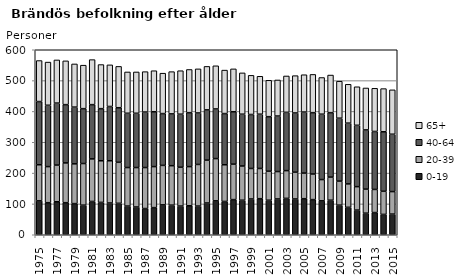
| Category | 0-19 | 20-39 | 40-64 | 65+ |
|---|---|---|---|---|
| 1975.0 | 110 | 117 | 205 | 133 |
| 1976.0 | 104 | 117 | 199 | 140 |
| 1977.0 | 107 | 119 | 201 | 140 |
| 1978.0 | 104 | 129 | 189 | 142 |
| 1979.0 | 101 | 129 | 184 | 140 |
| 1980.0 | 96 | 135 | 178 | 141 |
| 1981.0 | 108 | 138 | 176 | 146 |
| 1982.0 | 105 | 135 | 169 | 143 |
| 1983.0 | 103 | 137 | 176 | 135 |
| 1984.0 | 102 | 133 | 177 | 134 |
| 1985.0 | 93 | 125 | 176 | 134 |
| 1986.0 | 90 | 128 | 176 | 134 |
| 1987.0 | 85 | 133 | 180 | 131 |
| 1988.0 | 88 | 133 | 178 | 133 |
| 1989.0 | 97 | 128 | 168 | 131 |
| 1990.0 | 96 | 128 | 168 | 137 |
| 1991.0 | 93 | 126 | 172 | 141 |
| 1992.0 | 94 | 127 | 175 | 140 |
| 1993.0 | 93 | 135 | 167 | 143 |
| 1994.0 | 103 | 139 | 163 | 141 |
| 1995.0 | 110 | 137 | 161 | 140 |
| 1996.0 | 108 | 119 | 166 | 141 |
| 1997.0 | 114 | 115 | 170 | 139 |
| 1998.0 | 112 | 111 | 168 | 134 |
| 1999.0 | 116 | 99 | 175 | 127 |
| 2000.0 | 117 | 98 | 176 | 123 |
| 2001.0 | 112 | 94 | 177 | 118 |
| 2002.0 | 116 | 89 | 180 | 117 |
| 2003.0 | 118 | 90 | 189 | 118 |
| 2004.0 | 116 | 87 | 192 | 121 |
| 2005.0 | 117 | 83 | 198 | 121 |
| 2006.0 | 114 | 83 | 199 | 124 |
| 2007.0 | 110 | 69 | 212 | 119 |
| 2008.0 | 112 | 75 | 209 | 122 |
| 2009.0 | 96 | 78 | 204 | 120 |
| 2010.0 | 89 | 76 | 197 | 126 |
| 2011.0 | 80 | 76 | 199 | 125 |
| 2012.0 | 70 | 78 | 192 | 136 |
| 2013.0 | 72 | 75 | 188 | 140 |
| 2014.0 | 66 | 75 | 193 | 140 |
| 2015.0 | 67 | 73 | 186 | 144 |